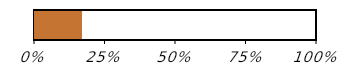
| Category | Purchasing progress (1 of 6) |
|---|---|
| Bought | 0.167 |